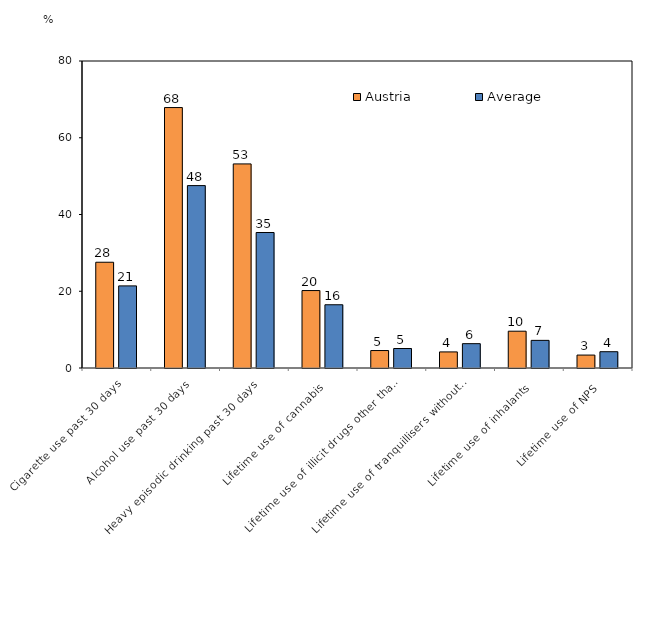
| Category | Austria | Average |
|---|---|---|
| Cigarette use past 30 days | 27.56 | 21.397 |
| Alcohol use past 30 days | 67.87 | 47.531 |
| Heavy episodic drinking past 30 days | 53.18 | 35.309 |
| Lifetime use of cannabis | 20.18 | 16.48 |
| Lifetime use of illicit drugs other than cannabis | 4.55 | 5.079 |
| Lifetime use of tranquillisers without prescription  | 4.19 | 6.34 |
| Lifetime use of inhalants | 9.59 | 7.202 |
| Lifetime use of NPS | 3.37 | 4.246 |